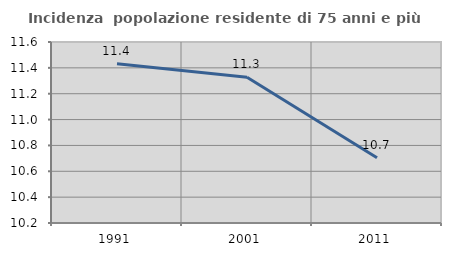
| Category | Incidenza  popolazione residente di 75 anni e più |
|---|---|
| 1991.0 | 11.431 |
| 2001.0 | 11.327 |
| 2011.0 | 10.705 |